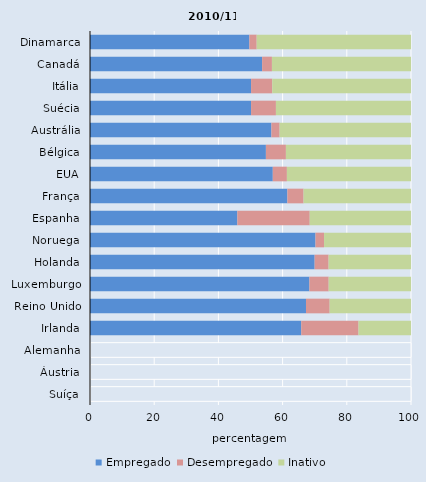
| Category | Empregado | Desempregado | Inativo |
|---|---|---|---|
| Dinamarca | 49.649 | 2.285 | 48.067 |
| Canadá | 53.621 | 3.055 | 43.324 |
| Itália | 50.176 | 6.598 | 43.226 |
| Suécia | 50.176 | 7.746 | 42.077 |
| Austrália | 56.513 | 2.566 | 40.921 |
| Bélgica | 54.799 | 6.233 | 38.967 |
| EUA | 56.945 | 4.394 | 38.661 |
| França | 61.492 | 5.038 | 33.471 |
| Espanha | 45.897 | 22.553 | 31.551 |
| Noruega | 70.249 | 2.664 | 27.087 |
| Holanda | 69.983 | 4.352 | 25.665 |
| Luxemburgo | 68.353 | 6.004 | 25.643 |
| Reino Unido | 67.286 | 7.376 | 25.337 |
| Irlanda | 65.807 | 17.844 | 16.349 |
| Alemanha | 0 | 100 | 0 |
| Áustria | 0 | 100 | 0 |
| Suíça | 0 | 100 | 0 |